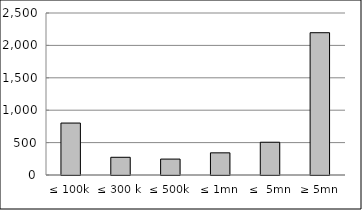
| Category | Series 0 |
|---|---|
| ≤ 100k | 801644693.027 |
| ≤ 300 k | 273354688.942 |
| ≤ 500k | 245598548.792 |
| ≤ 1mn | 342101429.52 |
| ≤  5mn | 505404741.081 |
| ≥ 5mn | 2195840348.991 |